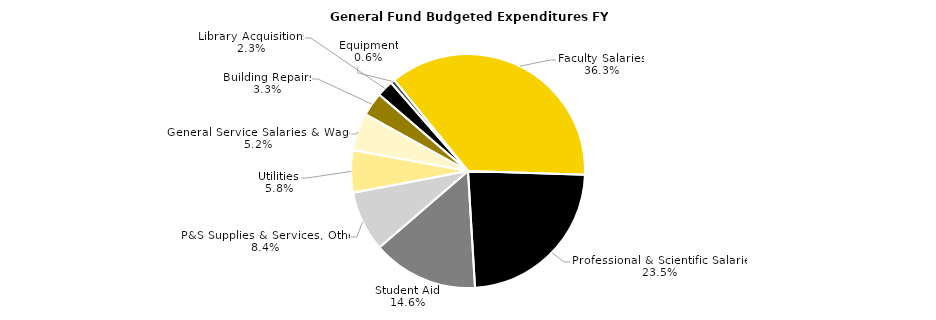
| Category | Series 0 |
|---|---|
| Faculty Salaries | 291.486 |
| Professional & Scientific Salaries | 188.724 |
| Student Aid | 117.338 |
| P&S Supplies & Services, Other | 66.991 |
| Utilities | 46.808 |
| General Service Salaries & Wages | 41.615 |
| Building Repairs | 26.112 |
| Library Acquisitions | 18.233 |
| Equipment | 4.733 |